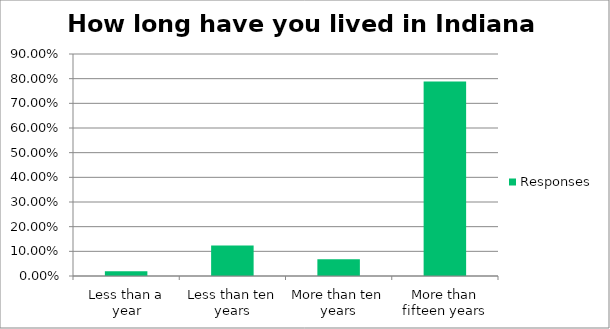
| Category | Responses |
|---|---|
| Less than a year | 0.019 |
| Less than ten years | 0.124 |
| More than ten years | 0.068 |
| More than fifteen years | 0.789 |